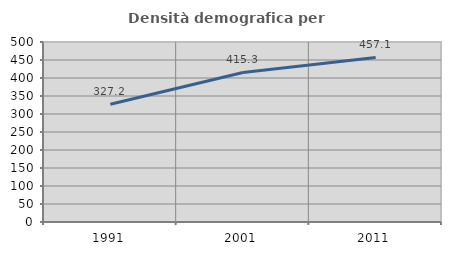
| Category | Densità demografica |
|---|---|
| 1991.0 | 327.163 |
| 2001.0 | 415.348 |
| 2011.0 | 457.085 |